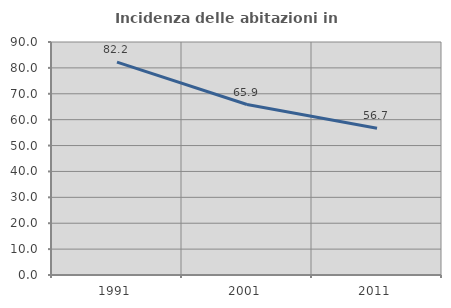
| Category | Incidenza delle abitazioni in proprietà  |
|---|---|
| 1991.0 | 82.249 |
| 2001.0 | 65.854 |
| 2011.0 | 56.667 |